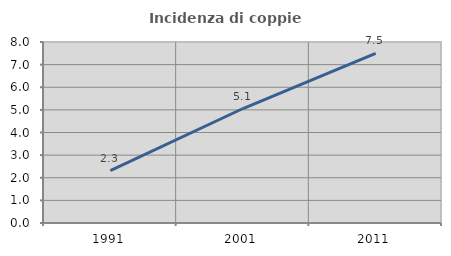
| Category | Incidenza di coppie miste |
|---|---|
| 1991.0 | 2.315 |
| 2001.0 | 5.06 |
| 2011.0 | 7.495 |